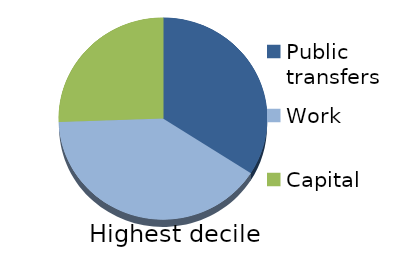
| Category | Series 0 |
|---|---|
| Public transfers | 0.341 |
| Work | 0.404 |
| Capital | 0.256 |